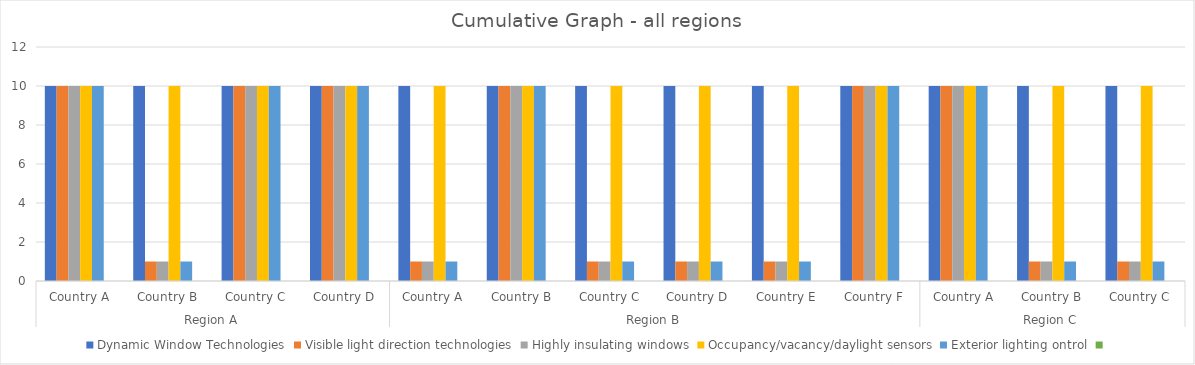
| Category | Dynamic Window Technologies | Visible light direction technologies | Highly insulating windows | Occupancy/vacancy/daylight sensors | Exterior lighting ontrol | Series 5 |
|---|---|---|---|---|---|---|
| 0 | 10 | 10 | 10 | 10 | 10 |  |
| 1 | 10 | 1 | 1 | 10 | 1 |  |
| 2 | 10 | 10 | 10 | 10 | 10 |  |
| 3 | 10 | 10 | 10 | 10 | 10 |  |
| 4 | 10 | 1 | 1 | 10 | 1 |  |
| 5 | 10 | 10 | 10 | 10 | 10 |  |
| 6 | 10 | 1 | 1 | 10 | 1 |  |
| 7 | 10 | 1 | 1 | 10 | 1 |  |
| 8 | 10 | 1 | 1 | 10 | 1 |  |
| 9 | 10 | 10 | 10 | 10 | 10 |  |
| 10 | 10 | 10 | 10 | 10 | 10 |  |
| 11 | 10 | 1 | 1 | 10 | 1 |  |
| 12 | 10 | 1 | 1 | 10 | 1 |  |